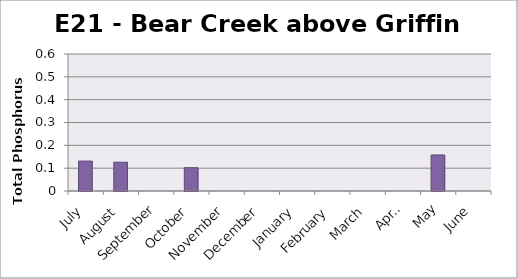
| Category | Phosphorus (mg/L) |
|---|---|
| July | 0.131 |
| August | 0.126 |
| September | 0 |
| October | 0.102 |
| November | 0 |
| December | 0 |
| January | 0 |
| February | 0 |
| March | 0 |
| April | 0 |
| May | 0.158 |
| June | 0 |